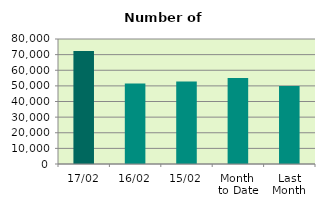
| Category | Series 0 |
|---|---|
| 17/02 | 72366 |
| 16/02 | 51538 |
| 15/02 | 52754 |
| Month 
to Date | 54984.769 |
| Last
Month | 49894.952 |